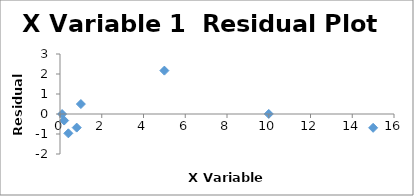
| Category | Series 0 |
|---|---|
| 0.1 | -0.003 |
| 0.2 | -0.328 |
| 0.4 | -0.967 |
| 0.8 | -0.68 |
| 1.0 | 0.497 |
| 5.0 | 2.169 |
| 10.0 | 0.002 |
| 15.0 | -0.691 |